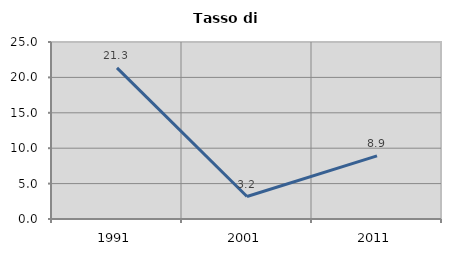
| Category | Tasso di disoccupazione   |
|---|---|
| 1991.0 | 21.348 |
| 2001.0 | 3.17 |
| 2011.0 | 8.924 |